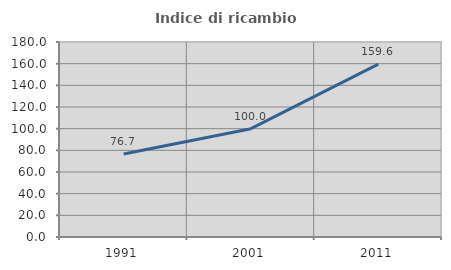
| Category | Indice di ricambio occupazionale  |
|---|---|
| 1991.0 | 76.667 |
| 2001.0 | 100 |
| 2011.0 | 159.649 |